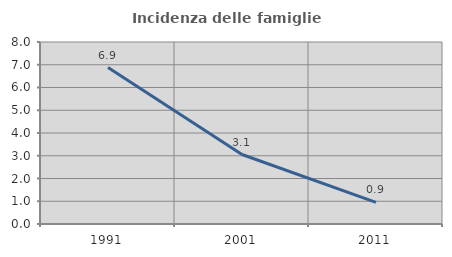
| Category | Incidenza delle famiglie numerose |
|---|---|
| 1991.0 | 6.878 |
| 2001.0 | 3.053 |
| 2011.0 | 0.948 |